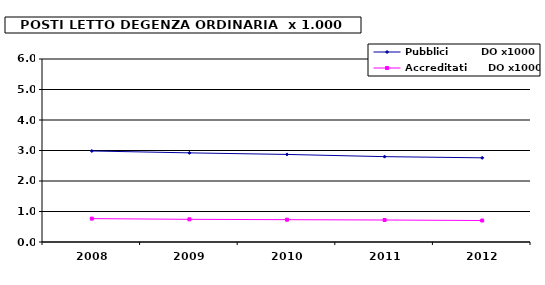
| Category | Pubblici           DO x1000 | Accreditati       DO x1000 |
|---|---|---|
| 2008.0 | 2.984 | 0.767 |
| 2009.0 | 2.923 | 0.743 |
| 2010.0 | 2.871 | 0.732 |
| 2011.0 | 2.798 | 0.721 |
| 2012.0 | 2.76 | 0.705 |